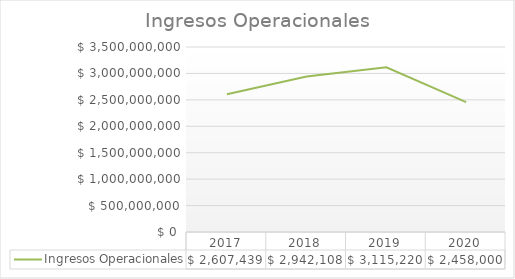
| Category | Ingresos Operacionales |
|---|---|
| 2017.0 | 2607439000 |
| 2018.0 | 2942108510 |
| 2019.0 | 3115220000 |
| 2020.0 | 2458000000 |